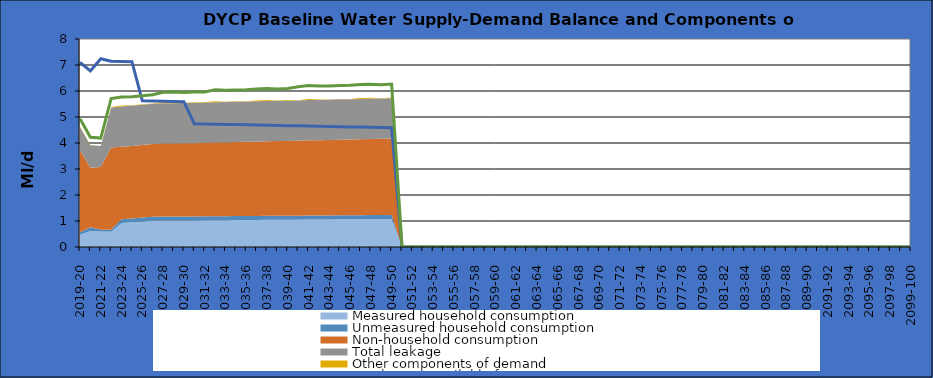
| Category | Total water available for use | Total demand + target headroom (baseline) |
|---|---|---|
| 0 | 7.1 | 4.93 |
| 1 | 6.77 | 4.22 |
| 2 | 7.24 | 4.188 |
| 3 | 7.144 | 5.712 |
| 4 | 7.136 | 5.77 |
| 5 | 7.128 | 5.781 |
| 6 | 5.62 | 5.817 |
| 7 | 5.612 | 5.853 |
| 8 | 5.604 | 5.954 |
| 9 | 5.596 | 5.96 |
| 10 | 5.588 | 5.941 |
| 11 | 4.74 | 5.962 |
| 12 | 4.732 | 5.963 |
| 13 | 4.724 | 6.044 |
| 14 | 4.716 | 6.025 |
| 15 | 4.708 | 6.041 |
| 16 | 4.7 | 6.047 |
| 17 | 4.692 | 6.078 |
| 18 | 4.684 | 6.094 |
| 19 | 4.676 | 6.075 |
| 20 | 4.668 | 6.096 |
| 21 | 4.66 | 6.167 |
| 22 | 4.652 | 6.208 |
| 23 | 4.644 | 6.189 |
| 24 | 4.636 | 6.195 |
| 25 | 4.628 | 6.211 |
| 26 | 4.62 | 6.217 |
| 27 | 4.612 | 6.248 |
| 28 | 4.604 | 6.264 |
| 29 | 4.596 | 6.245 |
| 30 | 4.588 | 6.266 |
| 31 | 0 | 0 |
| 32 | 0 | 0 |
| 33 | 0 | 0 |
| 34 | 0 | 0 |
| 35 | 0 | 0 |
| 36 | 0 | 0 |
| 37 | 0 | 0 |
| 38 | 0 | 0 |
| 39 | 0 | 0 |
| 40 | 0 | 0 |
| 41 | 0 | 0 |
| 42 | 0 | 0 |
| 43 | 0 | 0 |
| 44 | 0 | 0 |
| 45 | 0 | 0 |
| 46 | 0 | 0 |
| 47 | 0 | 0 |
| 48 | 0 | 0 |
| 49 | 0 | 0 |
| 50 | 0 | 0 |
| 51 | 0 | 0 |
| 52 | 0 | 0 |
| 53 | 0 | 0 |
| 54 | 0 | 0 |
| 55 | 0 | 0 |
| 56 | 0 | 0 |
| 57 | 0 | 0 |
| 58 | 0 | 0 |
| 59 | 0 | 0 |
| 60 | 0 | 0 |
| 61 | 0 | 0 |
| 62 | 0 | 0 |
| 63 | 0 | 0 |
| 64 | 0 | 0 |
| 65 | 0 | 0 |
| 66 | 0 | 0 |
| 67 | 0 | 0 |
| 68 | 0 | 0 |
| 69 | 0 | 0 |
| 70 | 0 | 0 |
| 71 | 0 | 0 |
| 72 | 0 | 0 |
| 73 | 0 | 0 |
| 74 | 0 | 0 |
| 75 | 0 | 0 |
| 76 | 0 | 0 |
| 77 | 0 | 0 |
| 78 | 0 | 0 |
| 79 | 0 | 0 |
| 80 | 0 | 0 |